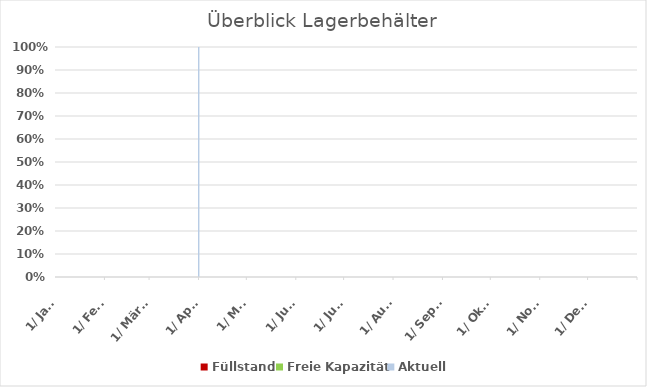
| Category | Aktuell |
|---|---|
| 2022-01-01 | 0 |
| 2022-01-02 | 0 |
| 2022-01-03 | 0 |
| 2022-01-04 | 0 |
| 2022-01-05 | 0 |
| 2022-01-06 | 0 |
| 2022-01-07 | 0 |
| 2022-01-08 | 0 |
| 2022-01-09 | 0 |
| 2022-01-10 | 0 |
| 2022-01-11 | 0 |
| 2022-01-12 | 0 |
| 2022-01-13 | 0 |
| 2022-01-14 | 0 |
| 2022-01-15 | 0 |
| 2022-01-16 | 0 |
| 2022-01-17 | 0 |
| 2022-01-18 | 0 |
| 2022-01-19 | 0 |
| 2022-01-20 | 0 |
| 2022-01-21 | 0 |
| 2022-01-22 | 0 |
| 2022-01-23 | 0 |
| 2022-01-24 | 0 |
| 2022-01-25 | 0 |
| 2022-01-26 | 0 |
| 2022-01-27 | 0 |
| 2022-01-28 | 0 |
| 2022-01-29 | 0 |
| 2022-01-30 | 0 |
| 2022-01-31 | 0 |
| 2022-02-01 | 0 |
| 2022-02-02 | 0 |
| 2022-02-03 | 0 |
| 2022-02-04 | 0 |
| 2022-02-05 | 0 |
| 2022-02-06 | 0 |
| 2022-02-07 | 0 |
| 2022-02-08 | 0 |
| 2022-02-09 | 0 |
| 2022-02-10 | 0 |
| 2022-02-11 | 0 |
| 2022-02-12 | 0 |
| 2022-02-13 | 0 |
| 2022-02-14 | 0 |
| 2022-02-15 | 0 |
| 2022-02-16 | 0 |
| 2022-02-17 | 0 |
| 2022-02-18 | 0 |
| 2022-02-19 | 0 |
| 2022-02-20 | 0 |
| 2022-02-21 | 0 |
| 2022-02-22 | 0 |
| 2022-02-23 | 0 |
| 2022-02-24 | 0 |
| 2022-02-25 | 0 |
| 2022-02-26 | 0 |
| 2022-02-27 | 0 |
| 2022-02-28 | 0 |
| 2022-03-01 | 0 |
| 2022-03-02 | 0 |
| 2022-03-03 | 0 |
| 2022-03-04 | 0 |
| 2022-03-05 | 0 |
| 2022-03-06 | 0 |
| 2022-03-07 | 0 |
| 2022-03-08 | 0 |
| 2022-03-09 | 0 |
| 2022-03-10 | 0 |
| 2022-03-11 | 0 |
| 2022-03-12 | 0 |
| 2022-03-13 | 0 |
| 2022-03-14 | 0 |
| 2022-03-15 | 0 |
| 2022-03-16 | 0 |
| 2022-03-17 | 0 |
| 2022-03-18 | 0 |
| 2022-03-19 | 0 |
| 2022-03-20 | 0 |
| 2022-03-21 | 0 |
| 2022-03-22 | 0 |
| 2022-03-23 | 0 |
| 2022-03-24 | 0 |
| 2022-03-25 | 0 |
| 2022-03-26 | 0 |
| 2022-03-27 | 0 |
| 2022-03-28 | 0 |
| 2022-03-29 | 0 |
| 2022-03-30 | 0 |
| 2022-03-31 | 100 |
| 2022-04-01 | 0 |
| 2022-04-02 | 0 |
| 2022-04-03 | 0 |
| 2022-04-04 | 0 |
| 2022-04-05 | 0 |
| 2022-04-06 | 0 |
| 2022-04-07 | 0 |
| 2022-04-08 | 0 |
| 2022-04-09 | 0 |
| 2022-04-10 | 0 |
| 2022-04-11 | 0 |
| 2022-04-12 | 0 |
| 2022-04-13 | 0 |
| 2022-04-14 | 0 |
| 2022-04-15 | 0 |
| 2022-04-16 | 0 |
| 2022-04-17 | 0 |
| 2022-04-18 | 0 |
| 2022-04-19 | 0 |
| 2022-04-20 | 0 |
| 2022-04-21 | 0 |
| 2022-04-22 | 0 |
| 2022-04-23 | 0 |
| 2022-04-24 | 0 |
| 2022-04-25 | 0 |
| 2022-04-26 | 0 |
| 2022-04-27 | 0 |
| 2022-04-28 | 0 |
| 2022-04-29 | 0 |
| 2022-04-30 | 0 |
| 2022-05-01 | 0 |
| 2022-05-02 | 0 |
| 2022-05-03 | 0 |
| 2022-05-04 | 0 |
| 2022-05-05 | 0 |
| 2022-05-06 | 0 |
| 2022-05-07 | 0 |
| 2022-05-08 | 0 |
| 2022-05-09 | 0 |
| 2022-05-10 | 0 |
| 2022-05-11 | 0 |
| 2022-05-12 | 0 |
| 2022-05-13 | 0 |
| 2022-05-14 | 0 |
| 2022-05-15 | 0 |
| 2022-05-16 | 0 |
| 2022-05-17 | 0 |
| 2022-05-18 | 0 |
| 2022-05-19 | 0 |
| 2022-05-20 | 0 |
| 2022-05-21 | 0 |
| 2022-05-22 | 0 |
| 2022-05-23 | 0 |
| 2022-05-24 | 0 |
| 2022-05-25 | 0 |
| 2022-05-26 | 0 |
| 2022-05-27 | 0 |
| 2022-05-28 | 0 |
| 2022-05-29 | 0 |
| 2022-05-30 | 0 |
| 2022-05-31 | 0 |
| 2022-06-01 | 0 |
| 2022-06-02 | 0 |
| 2022-06-03 | 0 |
| 2022-06-04 | 0 |
| 2022-06-05 | 0 |
| 2022-06-06 | 0 |
| 2022-06-07 | 0 |
| 2022-06-08 | 0 |
| 2022-06-09 | 0 |
| 2022-06-10 | 0 |
| 2022-06-11 | 0 |
| 2022-06-12 | 0 |
| 2022-06-13 | 0 |
| 2022-06-14 | 0 |
| 2022-06-15 | 0 |
| 2022-06-16 | 0 |
| 2022-06-17 | 0 |
| 2022-06-18 | 0 |
| 2022-06-19 | 0 |
| 2022-06-20 | 0 |
| 2022-06-21 | 0 |
| 2022-06-22 | 0 |
| 2022-06-23 | 0 |
| 2022-06-24 | 0 |
| 2022-06-25 | 0 |
| 2022-06-26 | 0 |
| 2022-06-27 | 0 |
| 2022-06-28 | 0 |
| 2022-06-29 | 0 |
| 2022-06-30 | 0 |
| 2022-07-01 | 0 |
| 2022-07-02 | 0 |
| 2022-07-03 | 0 |
| 2022-07-04 | 0 |
| 2022-07-05 | 0 |
| 2022-07-06 | 0 |
| 2022-07-07 | 0 |
| 2022-07-08 | 0 |
| 2022-07-09 | 0 |
| 2022-07-10 | 0 |
| 2022-07-11 | 0 |
| 2022-07-12 | 0 |
| 2022-07-13 | 0 |
| 2022-07-14 | 0 |
| 2022-07-15 | 0 |
| 2022-07-16 | 0 |
| 2022-07-17 | 0 |
| 2022-07-18 | 0 |
| 2022-07-19 | 0 |
| 2022-07-20 | 0 |
| 2022-07-21 | 0 |
| 2022-07-22 | 0 |
| 2022-07-23 | 0 |
| 2022-07-24 | 0 |
| 2022-07-25 | 0 |
| 2022-07-26 | 0 |
| 2022-07-27 | 0 |
| 2022-07-28 | 0 |
| 2022-07-29 | 0 |
| 2022-07-30 | 0 |
| 2022-07-31 | 0 |
| 2022-08-01 | 0 |
| 2022-08-02 | 0 |
| 2022-08-03 | 0 |
| 2022-08-04 | 0 |
| 2022-08-05 | 0 |
| 2022-08-06 | 0 |
| 2022-08-07 | 0 |
| 2022-08-08 | 0 |
| 2022-08-09 | 0 |
| 2022-08-10 | 0 |
| 2022-08-11 | 0 |
| 2022-08-12 | 0 |
| 2022-08-13 | 0 |
| 2022-08-14 | 0 |
| 2022-08-15 | 0 |
| 2022-08-16 | 0 |
| 2022-08-17 | 0 |
| 2022-08-18 | 0 |
| 2022-08-19 | 0 |
| 2022-08-20 | 0 |
| 2022-08-21 | 0 |
| 2022-08-22 | 0 |
| 2022-08-23 | 0 |
| 2022-08-24 | 0 |
| 2022-08-25 | 0 |
| 2022-08-26 | 0 |
| 2022-08-27 | 0 |
| 2022-08-28 | 0 |
| 2022-08-29 | 0 |
| 2022-08-30 | 0 |
| 2022-08-31 | 0 |
| 2022-09-01 | 0 |
| 2022-09-02 | 0 |
| 2022-09-03 | 0 |
| 2022-09-04 | 0 |
| 2022-09-05 | 0 |
| 2022-09-06 | 0 |
| 2022-09-07 | 0 |
| 2022-09-08 | 0 |
| 2022-09-09 | 0 |
| 2022-09-10 | 0 |
| 2022-09-11 | 0 |
| 2022-09-12 | 0 |
| 2022-09-13 | 0 |
| 2022-09-14 | 0 |
| 2022-09-15 | 0 |
| 2022-09-16 | 0 |
| 2022-09-17 | 0 |
| 2022-09-18 | 0 |
| 2022-09-19 | 0 |
| 2022-09-20 | 0 |
| 2022-09-21 | 0 |
| 2022-09-22 | 0 |
| 2022-09-23 | 0 |
| 2022-09-24 | 0 |
| 2022-09-25 | 0 |
| 2022-09-26 | 0 |
| 2022-09-27 | 0 |
| 2022-09-28 | 0 |
| 2022-09-29 | 0 |
| 2022-09-30 | 0 |
| 2022-10-01 | 0 |
| 2022-10-02 | 0 |
| 2022-10-03 | 0 |
| 2022-10-04 | 0 |
| 2022-10-05 | 0 |
| 2022-10-06 | 0 |
| 2022-10-07 | 0 |
| 2022-10-08 | 0 |
| 2022-10-09 | 0 |
| 2022-10-10 | 0 |
| 2022-10-11 | 0 |
| 2022-10-12 | 0 |
| 2022-10-13 | 0 |
| 2022-10-14 | 0 |
| 2022-10-15 | 0 |
| 2022-10-16 | 0 |
| 2022-10-17 | 0 |
| 2022-10-18 | 0 |
| 2022-10-19 | 0 |
| 2022-10-20 | 0 |
| 2022-10-21 | 0 |
| 2022-10-22 | 0 |
| 2022-10-23 | 0 |
| 2022-10-24 | 0 |
| 2022-10-25 | 0 |
| 2022-10-26 | 0 |
| 2022-10-27 | 0 |
| 2022-10-28 | 0 |
| 2022-10-29 | 0 |
| 2022-10-30 | 0 |
| 2022-10-31 | 0 |
| 2022-11-01 | 0 |
| 2022-11-02 | 0 |
| 2022-11-03 | 0 |
| 2022-11-04 | 0 |
| 2022-11-05 | 0 |
| 2022-11-06 | 0 |
| 2022-11-07 | 0 |
| 2022-11-08 | 0 |
| 2022-11-09 | 0 |
| 2022-11-10 | 0 |
| 2022-11-11 | 0 |
| 2022-11-12 | 0 |
| 2022-11-13 | 0 |
| 2022-11-14 | 0 |
| 2022-11-15 | 0 |
| 2022-11-16 | 0 |
| 2022-11-17 | 0 |
| 2022-11-18 | 0 |
| 2022-11-19 | 0 |
| 2022-11-20 | 0 |
| 2022-11-21 | 0 |
| 2022-11-22 | 0 |
| 2022-11-23 | 0 |
| 2022-11-24 | 0 |
| 2022-11-25 | 0 |
| 2022-11-26 | 0 |
| 2022-11-27 | 0 |
| 2022-11-28 | 0 |
| 2022-11-29 | 0 |
| 2022-11-30 | 0 |
| 2022-12-01 | 0 |
| 2022-12-02 | 0 |
| 2022-12-03 | 0 |
| 2022-12-04 | 0 |
| 2022-12-05 | 0 |
| 2022-12-06 | 0 |
| 2022-12-07 | 0 |
| 2022-12-08 | 0 |
| 2022-12-09 | 0 |
| 2022-12-10 | 0 |
| 2022-12-11 | 0 |
| 2022-12-12 | 0 |
| 2022-12-13 | 0 |
| 2022-12-14 | 0 |
| 2022-12-15 | 0 |
| 2022-12-16 | 0 |
| 2022-12-17 | 0 |
| 2022-12-18 | 0 |
| 2022-12-19 | 0 |
| 2022-12-20 | 0 |
| 2022-12-21 | 0 |
| 2022-12-22 | 0 |
| 2022-12-23 | 0 |
| 2022-12-24 | 0 |
| 2022-12-25 | 0 |
| 2022-12-26 | 0 |
| 2022-12-27 | 0 |
| 2022-12-28 | 0 |
| 2022-12-29 | 0 |
| 2022-12-30 | 0 |
| 2022-12-31 | 0 |